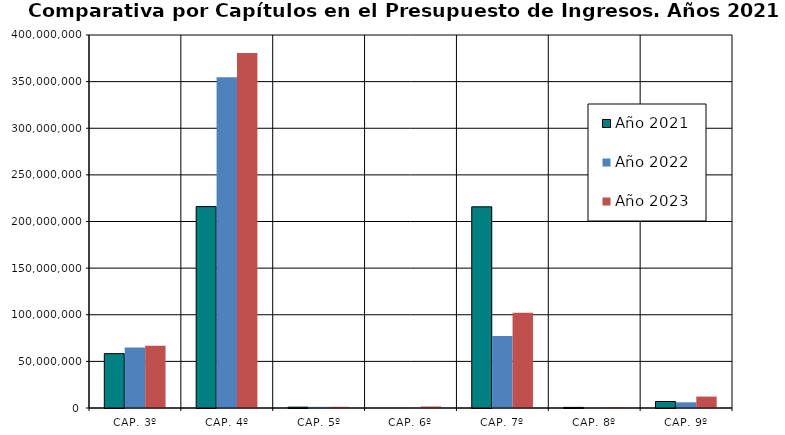
| Category | Año 2021 | Año 2022 | Año 2023 |
|---|---|---|---|
| CAP. 3º | 58279674 | 64830025 | 66628296.17 |
| CAP. 4º | 215954522.241 | 354755067.898 | 380692905.71 |
| CAP. 5º | 893000 | 1206320 | 1279600 |
| CAP. 6º | 0 | 0 | 1615330 |
| CAP. 7º | 215749512.99 | 77236214.78 | 102135446.531 |
| CAP. 8º | 650000 | 650000 | 650000 |
| CAP. 9º | 6960000 | 6093440 | 12231060.8 |